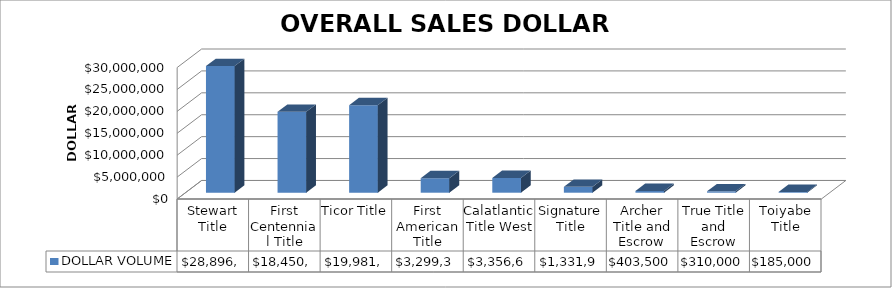
| Category | DOLLAR VOLUME |
|---|---|
| Stewart Title | 28896449 |
| First Centennial Title | 18450564 |
| Ticor Title | 19981622 |
| First American Title | 3299307 |
| Calatlantic Title West | 3356603 |
| Signature Title | 1331900 |
| Archer Title and Escrow | 403500 |
| True Title and Escrow | 310000 |
| Toiyabe Title | 185000 |